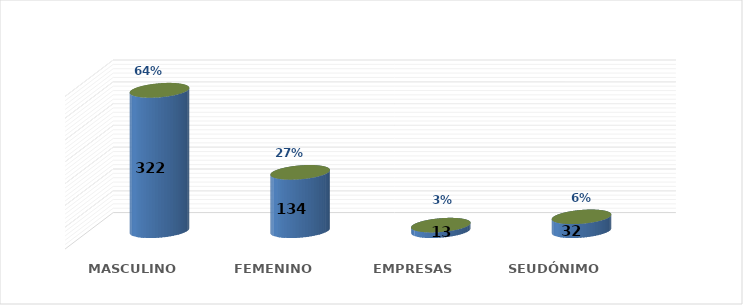
| Category | SOLICITUD POR GÉNERO | Series 1 |
|---|---|---|
| MASCULINO | 322 | 0.643 |
| FEMENINO | 134 | 0.267 |
| EMPRESAS | 13 | 0.026 |
| SEUDÓNIMO | 32 | 0.064 |